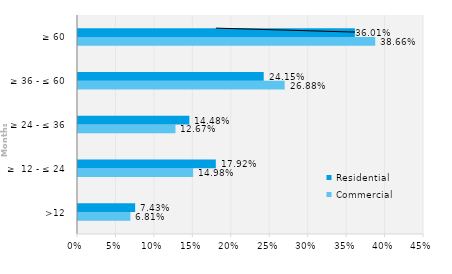
| Category | Commercial | Residential |
|---|---|---|
| >12 | 0.068 | 0.074 |
| ≥  12 - ≤ 24 | 0.15 | 0.179 |
| ≥ 24 - ≤ 36 | 0.127 | 0.145 |
| ≥ 36 - ≤ 60 | 0.269 | 0.242 |
| ≥ 60 | 0.387 | 0.36 |